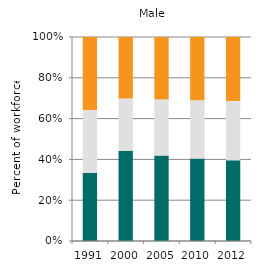
| Category | Agriculture | Industry | Services |
|---|---|---|---|
| 1991.0 | 33.319 | 30.862 | 35.819 |
| 2000.0 | 44.214 | 25.643 | 30.143 |
| 2005.0 | 41.883 | 27.523 | 30.594 |
| 2010.0 | 40.41 | 28.572 | 31.018 |
| 2012.0 | 39.559 | 29.035 | 31.406 |